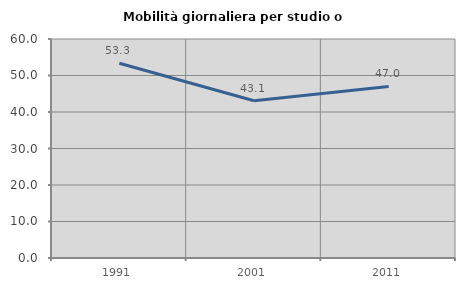
| Category | Mobilità giornaliera per studio o lavoro |
|---|---|
| 1991.0 | 53.344 |
| 2001.0 | 43.089 |
| 2011.0 | 46.999 |